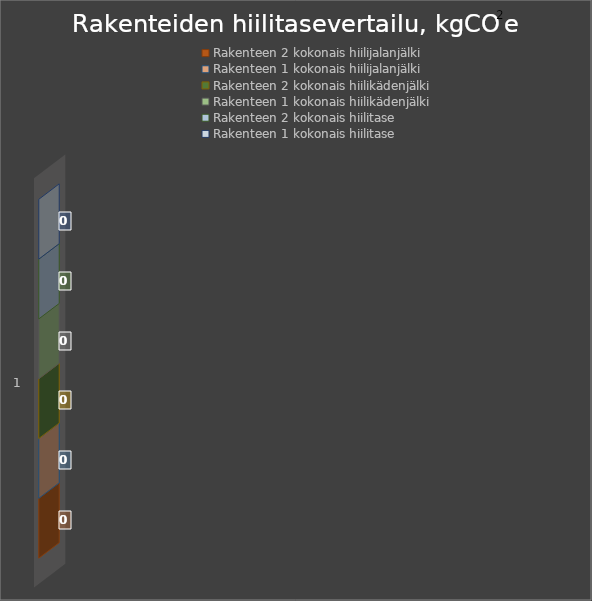
| Category | Rakenteen 2 kokonais hiilijalanjälki | Rakenteen 1 kokonais hiilijalanjälki | Rakenteen 2 kokonais hiilikädenjälki | Rakenteen 1 kokonais hiilikädenjälki | Rakenteen 2 kokonais hiilitase | Rakenteen 1 kokonais hiilitase |
|---|---|---|---|---|---|---|
| 0 | 0 | 0 | 0 | 0 | 0 | 0 |